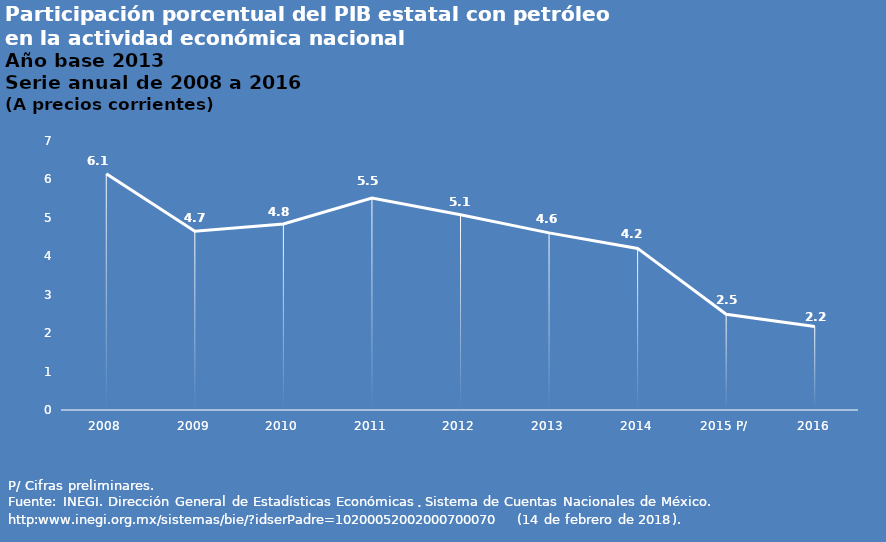
| Category | Series 0 |
|---|---|
| 2008 | 6.149 |
| 2009 | 4.652 |
| 2010 | 4.839 |
| 2011 | 5.513 |
| 2012 | 5.08 |
| 2013 | 4.61 |
| 2014 | 4.205 |
| 2015 P/ | 2.493 |
| 2016 | 2.175 |